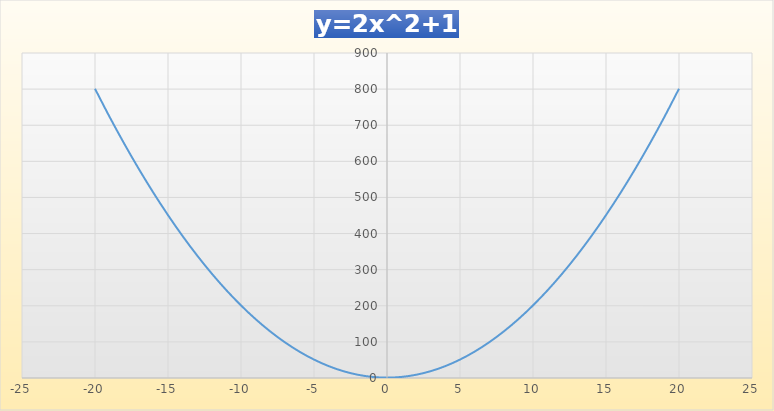
| Category | Series 0 |
|---|---|
| -20.0 | 801 |
| -19.0 | 723 |
| -18.0 | 649 |
| -17.0 | 579 |
| -16.0 | 513 |
| -15.0 | 451 |
| -14.0 | 393 |
| -13.0 | 339 |
| -12.0 | 289 |
| -11.0 | 243 |
| -10.0 | 201 |
| -9.0 | 163 |
| -8.0 | 129 |
| -7.0 | 99 |
| -6.0 | 73 |
| -5.0 | 51 |
| -4.0 | 33 |
| -3.0 | 19 |
| -2.0 | 9 |
| -1.0 | 3 |
| 0.0 | 1 |
| 1.0 | 3 |
| 2.0 | 9 |
| 3.0 | 19 |
| 4.0 | 33 |
| 5.0 | 51 |
| 6.0 | 73 |
| 7.0 | 99 |
| 8.0 | 129 |
| 9.0 | 163 |
| 10.0 | 201 |
| 11.0 | 243 |
| 12.0 | 289 |
| 13.0 | 339 |
| 14.0 | 393 |
| 15.0 | 451 |
| 16.0 | 513 |
| 17.0 | 579 |
| 18.0 | 649 |
| 19.0 | 723 |
| 20.0 | 801 |